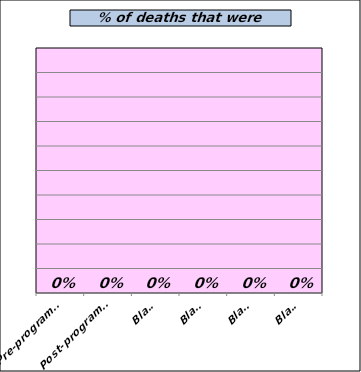
| Category | Expected  |
|---|---|
| Pre-programme | 0 |
| Post-programme | 0 |
| Blank | 0 |
| Blank | 0 |
| Blank | 0 |
| Blank | 0 |